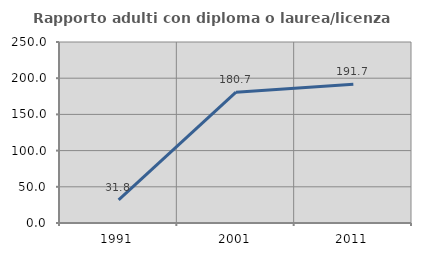
| Category | Rapporto adulti con diploma o laurea/licenza media  |
|---|---|
| 1991.0 | 31.818 |
| 2001.0 | 180.688 |
| 2011.0 | 191.688 |